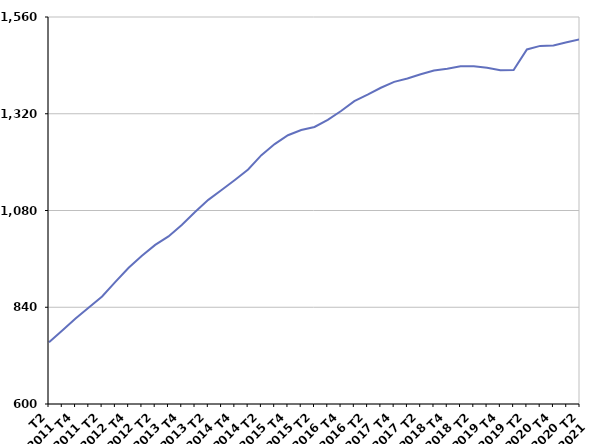
| Category | 50 ans ou plus |
|---|---|
| T2
2011 | 753.4 |
| T3
2011 | 782.4 |
| T4
2011 | 812 |
| T1
2012 | 839.4 |
| T2
2012 | 866.6 |
| T3
2012 | 902.8 |
| T4
2012 | 938 |
| T1
2013 | 967.7 |
| T2
2013 | 994.7 |
| T3
2013 | 1015.7 |
| T4
2013 | 1044.2 |
| T1
2014 | 1076.1 |
| T2
2014 | 1106.4 |
| T3
2014 | 1131 |
| T4
2014 | 1155.8 |
| T1
2015 | 1181.6 |
| T2
2015 | 1217.3 |
| T3
2015 | 1244.8 |
| T4
2015 | 1266.8 |
| T1
2016 | 1279.5 |
| T2
2016 | 1287.3 |
| T3
2016 | 1305 |
| T4
2016 | 1326.8 |
| T1
2017 | 1351.1 |
| T2
2017 | 1367.3 |
| T3
2017 | 1384.5 |
| T4
2017 | 1399 |
| T1
2018 | 1407.3 |
| T2
2018 | 1417.8 |
| T3
2018 | 1427.3 |
| T4
2018 | 1431.9 |
| T1
2019 | 1437.7 |
| T2
2019 | 1437.8 |
| T3
2019 | 1434.3 |
| T4
2019 | 1428.1 |
| T1
2020 | 1428.6 |
| T2
2020 | 1479.6 |
| T3
2020 | 1488.3 |
| T4
2020 | 1489.2 |
| T1
2021 | 1497.4 |
| T2
2021 | 1504.7 |